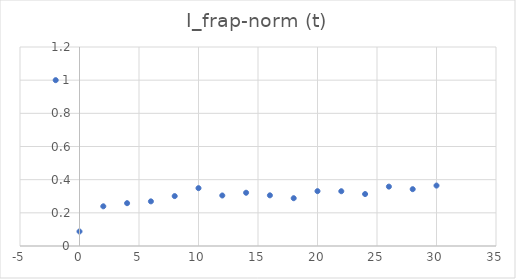
| Category | I_frap-norm (t) |
|---|---|
| -2.0 | 1 |
| 0.0 | 0.087 |
| 2.0 | 0.239 |
| 4.0 | 0.258 |
| 6.0 | 0.269 |
| 8.0 | 0.301 |
| 10.0 | 0.349 |
| 12.0 | 0.305 |
| 14.0 | 0.321 |
| 16.0 | 0.306 |
| 18.0 | 0.288 |
| 20.0 | 0.331 |
| 22.0 | 0.33 |
| 24.0 | 0.313 |
| 26.0 | 0.358 |
| 28.0 | 0.343 |
| 30.0 | 0.364 |